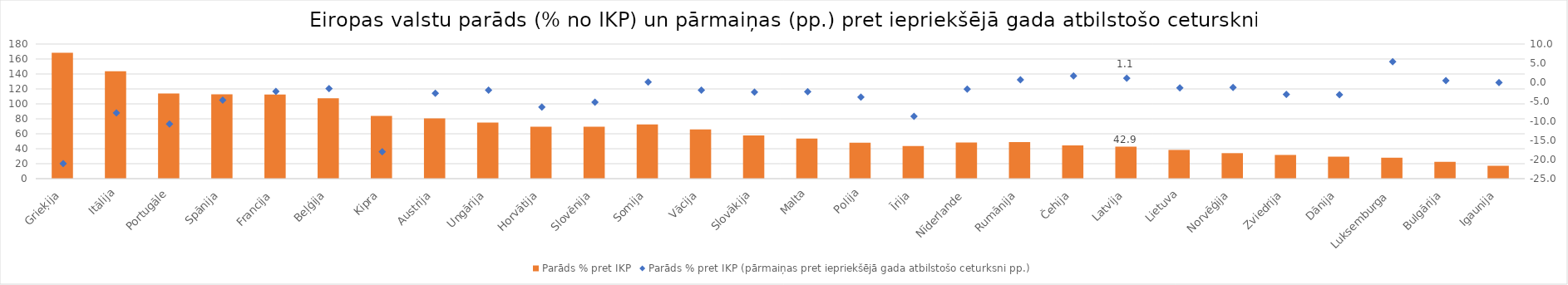
| Category | Parāds % pret IKP |
|---|---|
| Grieķija | 168.3 |
| Itālija | 143.5 |
| Portugāle | 113.8 |
| Spānija | 112.8 |
| Francija | 112.4 |
|  Beļģija | 107.4 |
| Kipra | 84 |
| Austrija | 80.6 |
| Ungārija | 74.9 |
| Horvātija | 69.5 |
| Slovēnija | 69.5 |
| Somija | 72.5 |
| Vācija | 65.9 |
| Slovākija | 57.9 |
| Malta | 53.6 |
| Polija | 48.1 |
| Īrija | 43.5 |
| Nīderlande | 48.3 |
| Rumānija | 49 |
| Čehija | 44.5 |
| Latvija | 42.9 |
| Lietuva | 38.4 |
| Norvēģija | 34.1 |
| Zviedrija | 31.7 |
| Dānija | 29.4 |
| Luksemburga | 28 |
| Bulgārija | 22.5 |
| Igaunija | 17.2 |